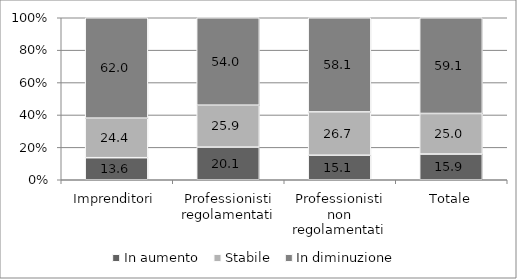
| Category | In aumento | Stabile | In diminuzione |
|---|---|---|---|
| Imprenditori | 13.616 | 24.408 | 61.976 |
| Professionisti regolamentati | 20.13 | 25.905 | 53.965 |
| Professionisti non regolamentati | 15.124 | 26.749 | 58.126 |
| Totale | 15.857 | 25.048 | 59.095 |